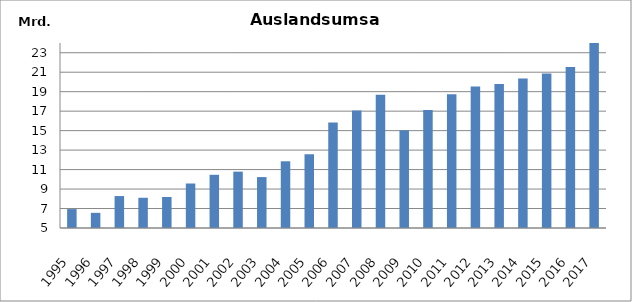
| Category | 1995 1996 1997 1998 1999 2000 2001 2002 2003 2004 2005 2006 2007 2008 2009 2010 2011 2012 2013 2014 2015 2016 2017 |
|---|---|
| 1995 | 6943144 |
| 1996 | 6557769 |
| 1997 | 8280764 |
| 1998 | 8105464 |
| 1999 | 8182730 |
| 2000 | 9569050 |
| 2001 | 10464574 |
| 2002 | 10788499 |
| 2003 | 10230107 |
| 2004 | 11851867 |
| 2005 | 12574466 |
| 2006 | 15829050 |
| 2007 | 17072669 |
| 2008 | 18677331 |
| 2009 | 15048748 |
| 2010 | 17119030.883 |
| 2011 | 18748015 |
| 2012 | 19537292 |
| 2013 | 19797360 |
| 2014 | 20348091 |
| 2015 | 20863282 |
| 2016 | 21526064 |
| 2017 | 24115077 |